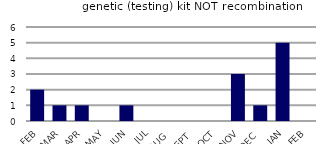
| Category | genetic (testing) kit NOT recombination |
|---|---|
| FEB | 2 |
| MAR | 1 |
| APR | 1 |
| MAY | 0 |
| JUN | 1 |
| JUL | 0 |
| AUG | 0 |
| SEPT | 0 |
| OCT | 0 |
| NOV | 3 |
| DEC | 1 |
| JAN | 5 |
| FEB | 0 |